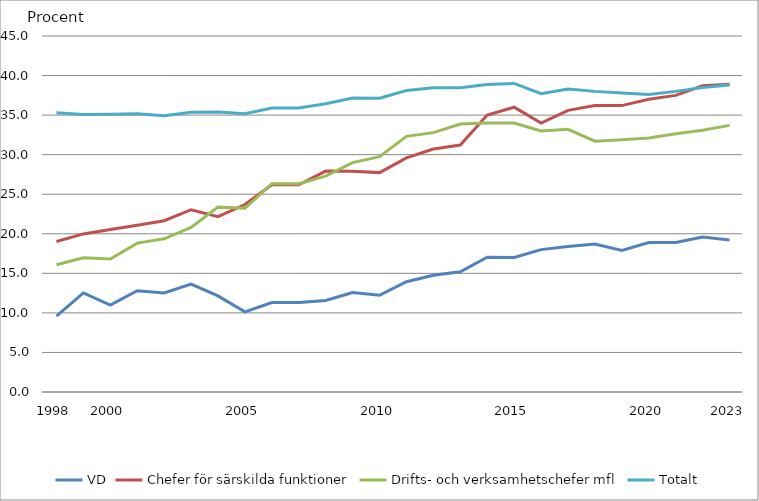
| Category | VD | Chefer för särskilda funktioner | Drifts- och verksamhetschefer mfl | Totalt |
|---|---|---|---|---|
| 1998.0 | 9.604 | 19.033 | 16.089 | 35.292 |
| nan | 12.521 | 19.982 | 16.974 | 35.071 |
| 2000.0 | 10.98 | 20.55 | 16.808 | 35.123 |
| nan | 12.797 | 21.08 | 18.819 | 35.167 |
| nan | 12.53 | 21.651 | 19.368 | 34.917 |
| nan | 13.641 | 23.042 | 20.809 | 35.372 |
| nan | 12.145 | 22.169 | 23.367 | 35.387 |
| 2005.0 | 10.126 | 23.7 | 23.22 | 35.175 |
| nan | 11.308 | 26.188 | 26.336 | 35.888 |
| nan | 11.308 | 26.188 | 26.336 | 35.888 |
| nan | 11.56 | 27.929 | 27.28 | 36.429 |
| nan | 12.574 | 27.894 | 28.99 | 37.173 |
| 2010.0 | 12.227 | 27.73 | 29.748 | 37.138 |
| nan | 13.946 | 29.585 | 32.315 | 38.103 |
| nan | 14.745 | 30.709 | 32.787 | 38.453 |
| nan | 15.187 | 31.225 | 33.875 | 38.458 |
| nan | 17.042 | 35 | 34 | 38.86 |
| 2015.0 | 17 | 36 | 34 | 39 |
| nan | 18 | 34 | 33 | 37.7 |
| nan | 18.4 | 35.6 | 33.2 | 38.3 |
| nan | 18.7 | 36.2 | 31.7 | 38 |
| nan | 17.9 | 36.2 | 31.9 | 37.8 |
| 2020.0 | 18.9 | 37 | 32.1 | 37.6 |
| nan | 18.895 | 37.491 | 32.655 | 38 |
| nan | 19.6 | 38.7 | 33.1 | 38.5 |
| 2023.0 | 19.2 | 38.9 | 33.7 | 38.8 |